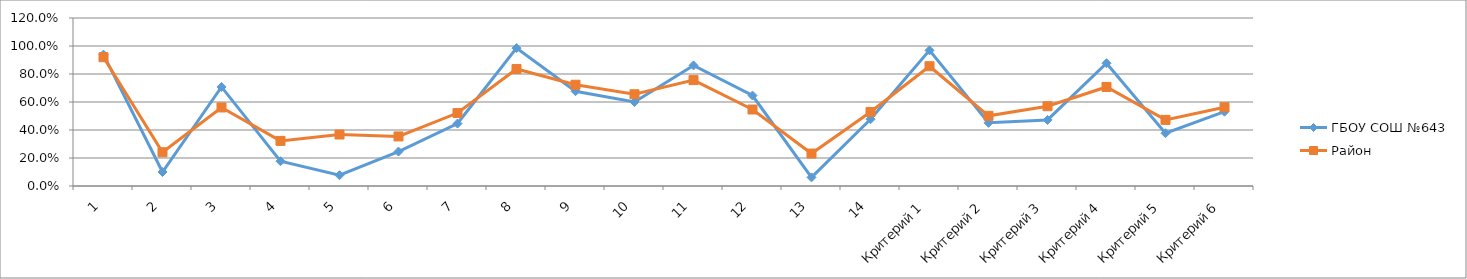
| Category | ГБОУ СОШ №643 | Район |
|---|---|---|
| 1 | 0.938 | 0.92 |
| 2 | 0.1 | 0.241 |
| 3 | 0.708 | 0.561 |
| 4 | 0.177 | 0.322 |
| 5 | 0.077 | 0.368 |
| 6 | 0.246 | 0.354 |
| 7 | 0.446 | 0.521 |
| 8 | 0.985 | 0.836 |
| 9 | 0.677 | 0.723 |
| 10 | 0.6 | 0.655 |
| 11 | 0.862 | 0.756 |
| 12 | 0.646 | 0.546 |
| 13 | 0.062 | 0.232 |
| 14 | 0.477 | 0.529 |
| Критерий 1 | 0.969 | 0.855 |
| Критерий 2 | 0.451 | 0.501 |
| Критерий 3 | 0.472 | 0.57 |
| Критерий 4 | 0.877 | 0.707 |
| Критерий 5 | 0.377 | 0.472 |
| Критерий 6 | 0.531 | 0.562 |